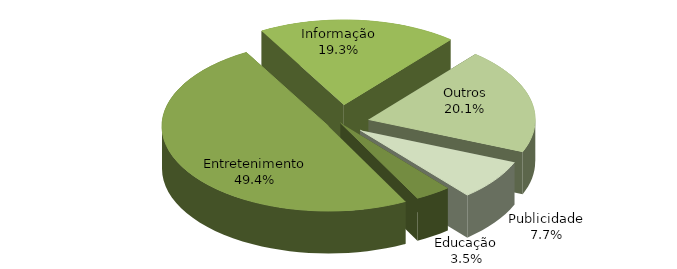
| Category | Series 0 |
|---|---|
| Educação | 0.035 |
| Entretenimento | 0.494 |
| Informação | 0.193 |
| Outros | 0.201 |
| Publicidade | 0.077 |